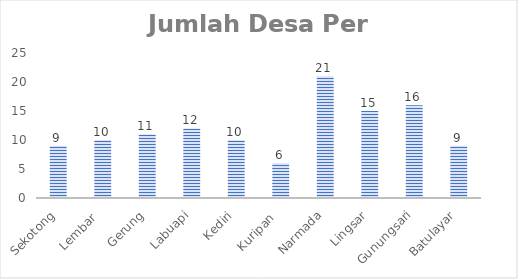
| Category | Series 0 |
|---|---|
| Sekotong | 9 |
| Lembar  | 10 |
| Gerung | 11 |
| Labuapi | 12 |
| Kediri | 10 |
| Kuripan  | 6 |
| Narmada | 21 |
| Lingsar | 15 |
| Gunungsari | 16 |
| Batulayar | 9 |